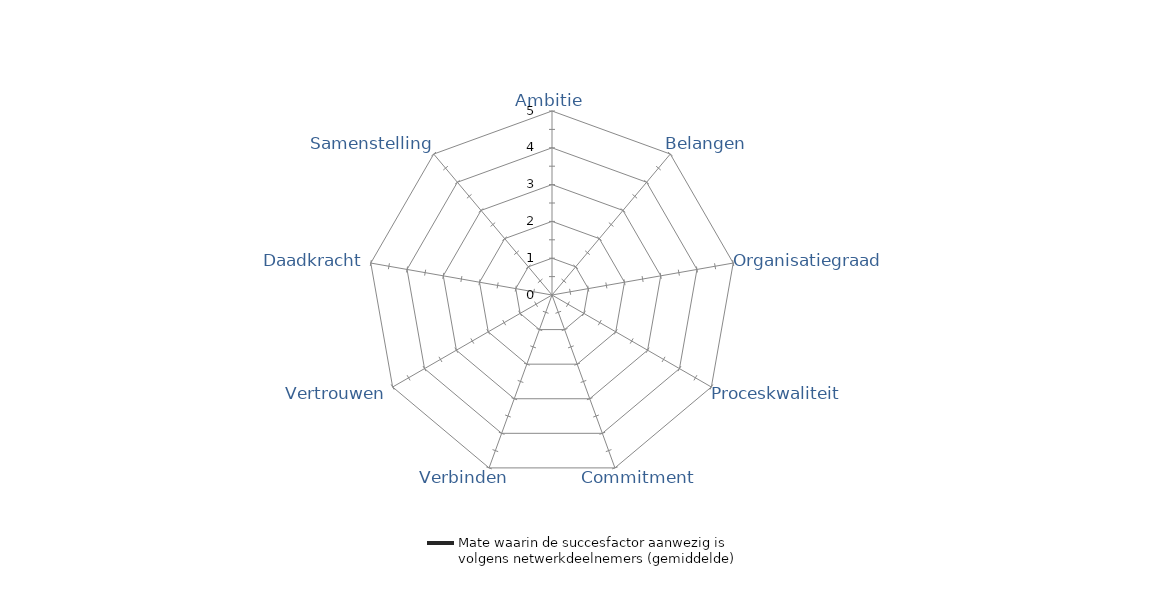
| Category | Mate waarin de succesfactor aanwezig is volgens netwerkdeelnemers (gemiddelde) |
|---|---|
| Ambitie | 0 |
| Belangen | 0 |
| Organisatiegraad | 0 |
| Proceskwaliteit | 0 |
| Commitment | 0 |
| Verbinden | 0 |
| Vertrouwen | 0 |
| Daadkracht | 0 |
| Samenstelling | 0 |